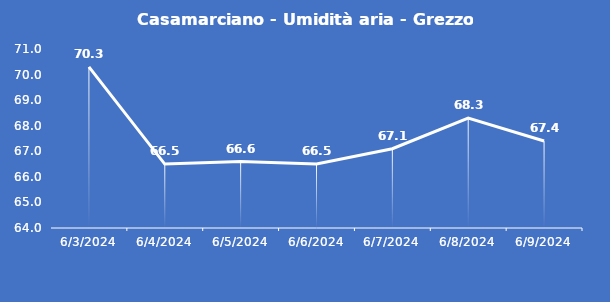
| Category | Casamarciano - Umidità aria - Grezzo (%) |
|---|---|
| 6/3/24 | 70.3 |
| 6/4/24 | 66.5 |
| 6/5/24 | 66.6 |
| 6/6/24 | 66.5 |
| 6/7/24 | 67.1 |
| 6/8/24 | 68.3 |
| 6/9/24 | 67.4 |